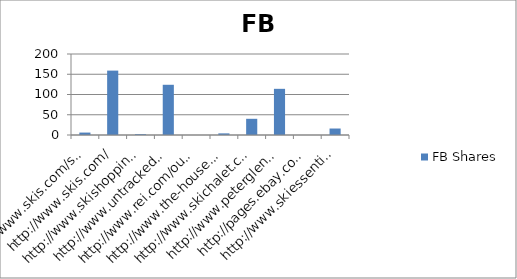
| Category | FB Shares |
|---|---|
| http://www.skis.com/ski-equipment/c9/ | 6 |
| http://www.skis.com/ | 159 |
| http://www.skishoppingguide.com/ | 2 |
| http://www.untracked.com/ | 124 |
| http://www.rei.com/outlet/category/22000078 | 0 |
| http://www.the-house.com/skis.html | 4 |
| http://www.skichalet.com/ | 40 |
| http://www.peterglenn.com/ | 114 |
| http://pages.ebay.com/buy/guides/skis-skiing-equipment-buying-guide/ | 0 |
| http://www.skiessentials.com/ | 16 |